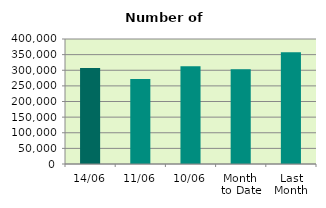
| Category | Series 0 |
|---|---|
| 14/06 | 307012 |
| 11/06 | 272150 |
| 10/06 | 312432 |
| Month 
to Date | 302979.8 |
| Last
Month | 357760.286 |